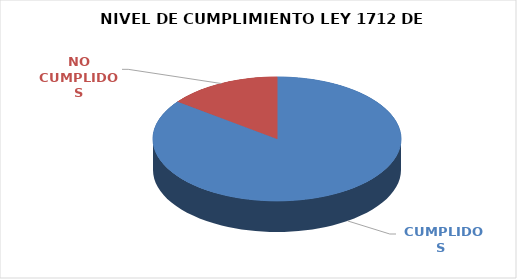
| Category | Series 0 |
|---|---|
|  CUMPLIDOS | 98 |
| NO CUMPLIDOS | 17 |